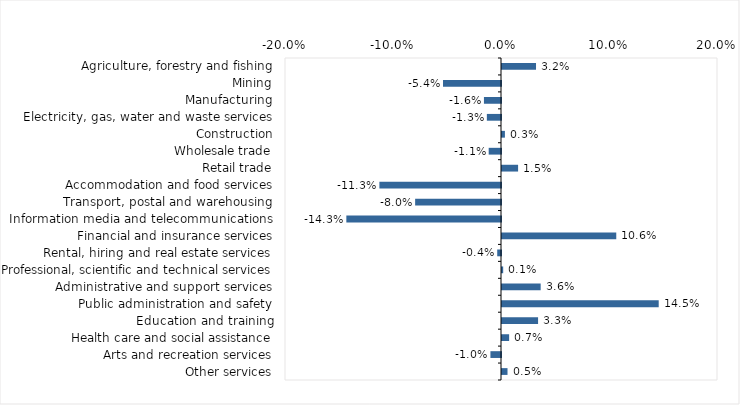
| Category | This week |
|---|---|
| Agriculture, forestry and fishing | 0.032 |
| Mining | -0.054 |
| Manufacturing | -0.016 |
| Electricity, gas, water and waste services | -0.013 |
| Construction | 0.003 |
| Wholesale trade | -0.011 |
| Retail trade | 0.015 |
| Accommodation and food services | -0.113 |
| Transport, postal and warehousing | -0.08 |
| Information media and telecommunications | -0.143 |
| Financial and insurance services | 0.106 |
| Rental, hiring and real estate services | -0.004 |
| Professional, scientific and technical services | 0.001 |
| Administrative and support services | 0.036 |
| Public administration and safety | 0.145 |
| Education and training | 0.033 |
| Health care and social assistance | 0.007 |
| Arts and recreation services | -0.01 |
| Other services | 0.005 |